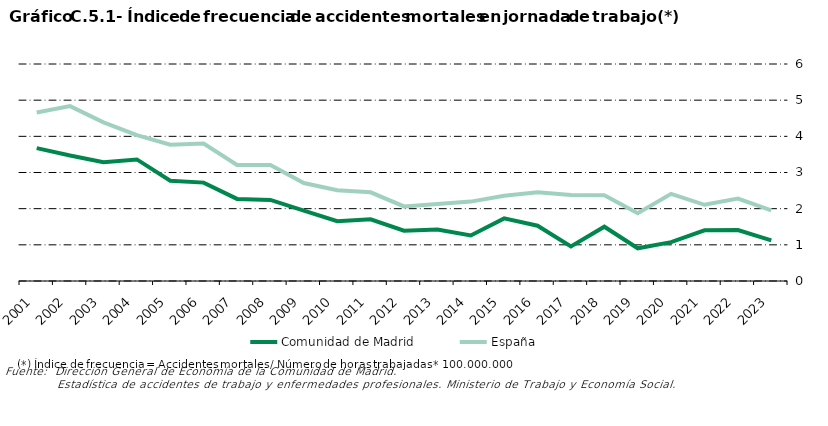
| Category | Comunidad de Madrid | España |
|---|---|---|
| 2001.0 | 3.674 | 4.66 |
| 2002.0 | 3.469 | 4.836 |
| 2003.0 | 3.285 | 4.387 |
| 2004.0 | 3.362 | 4.033 |
| 2005.0 | 2.771 | 3.769 |
| 2006.0 | 2.72 | 3.8 |
| 2007.0 | 2.27 | 3.21 |
| 2008.0 | 2.242 | 3.209 |
| 2009.0 | 1.947 | 2.709 |
| 2010.0 | 1.652 | 2.509 |
| 2011.0 | 1.707 | 2.452 |
| 2012.0 | 1.39 | 2.063 |
| 2013.0 | 1.425 | 2.129 |
| 2014.0 | 1.259 | 2.195 |
| 2015.0 | 1.731 | 2.358 |
| 2016.0 | 1.529 | 2.455 |
| 2017.0 | 0.958 | 2.376 |
| 2018.0 | 1.501 | 2.368 |
| 2019.0 | 0.904 | 1.875 |
| 2020.0 | 1.074 | 2.41 |
| 2021.0 | 1.403 | 2.107 |
| 2022.0 | 1.407 | 2.277 |
| 2023.0 | 1.122 | 1.953 |